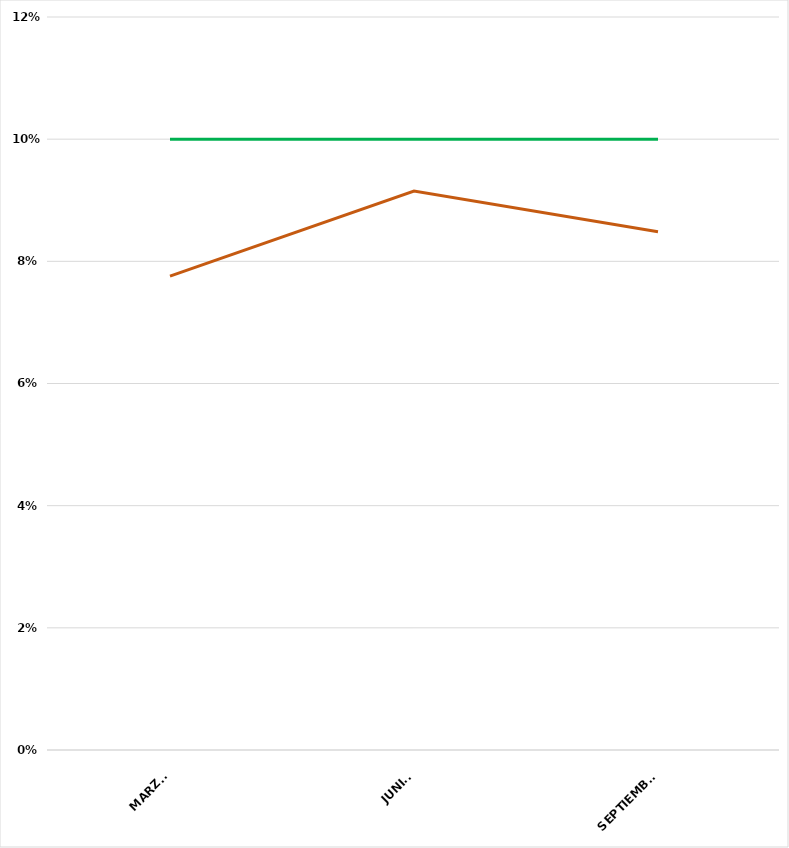
| Category | VALOR  | META PONDERADA |
|---|---|---|
| MARZO | 0.078 | 0.1 |
| JUNIO | 0.092 | 0.1 |
| SEPTIEMBRE | 0.085 | 0.1 |